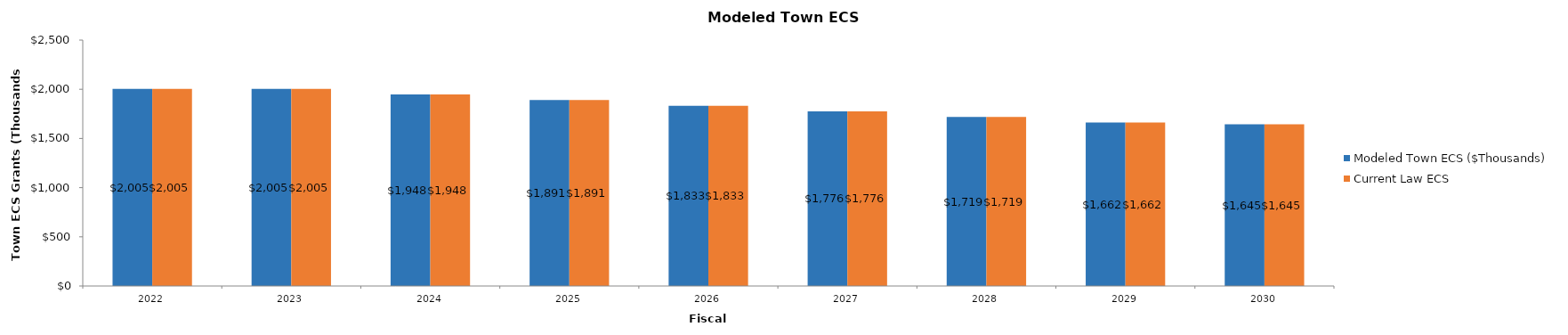
| Category | Modeled Town ECS ($Thousands) | Current Law ECS |
|---|---|---|
| 2022.0 | 2005 | 2005 |
| 2023.0 | 2005 | 2005 |
| 2024.0 | 1948 | 1948 |
| 2025.0 | 1891 | 1891 |
| 2026.0 | 1833 | 1833 |
| 2027.0 | 1776 | 1776 |
| 2028.0 | 1719 | 1719 |
| 2029.0 | 1662 | 1662 |
| 2030.0 | 1645 | 1645 |